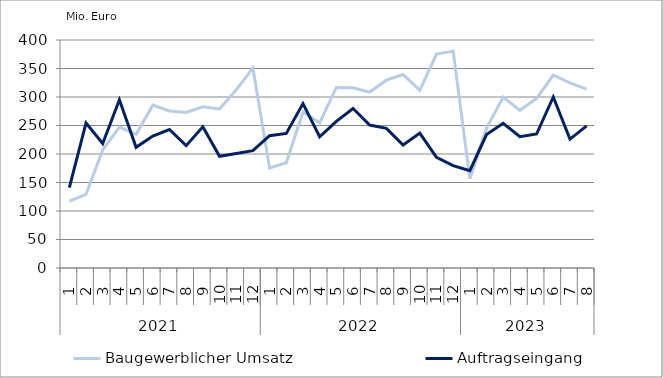
| Category | Baugewerblicher Umsatz | Auftragseingang |
|---|---|---|
| 0 | 117421.805 | 141020.655 |
| 1 | 129162.55 | 254416.876 |
| 2 | 207280.837 | 218451.405 |
| 3 | 247094.279 | 295077.868 |
| 4 | 234515.312 | 211696.129 |
| 5 | 285732.845 | 231455.155 |
| 6 | 275480.885 | 242932.505 |
| 7 | 272787.524 | 214636.944 |
| 8 | 282850.254 | 247827.991 |
| 9 | 279173.21 | 196069.238 |
| 10 | 312511.437 | 201015.897 |
| 11 | 350582.01 | 205949.991 |
| 12 | 175456.852 | 232178.255 |
| 13 | 184578.32 | 236006.862 |
| 14 | 273732.567 | 288451.109 |
| 15 | 254683.671 | 230228.968 |
| 16 | 316794.568 | 257235.39 |
| 17 | 316277.567 | 279900.179 |
| 18 | 308621.034 | 250827.343 |
| 19 | 329490.411 | 244949.341 |
| 20 | 339435.208 | 215809.075 |
| 21 | 311599.811 | 236674.056 |
| 22 | 375203.994 | 194107.214 |
| 23 | 380445.583 | 179631.624 |
| 24 | 156885.157 | 170764.939 |
| 25 | 245647.016 | 234064.391 |
| 26 | 299793.904 | 253873.168 |
| 27 | 276653.498 | 230304.701 |
| 28 | 297513.239 | 235047.978 |
| 29 | 338296.53 | 299989.264 |
| 30 | 324660.651 | 226217.704 |
| 31 | 313657.31 | 249461.868 |